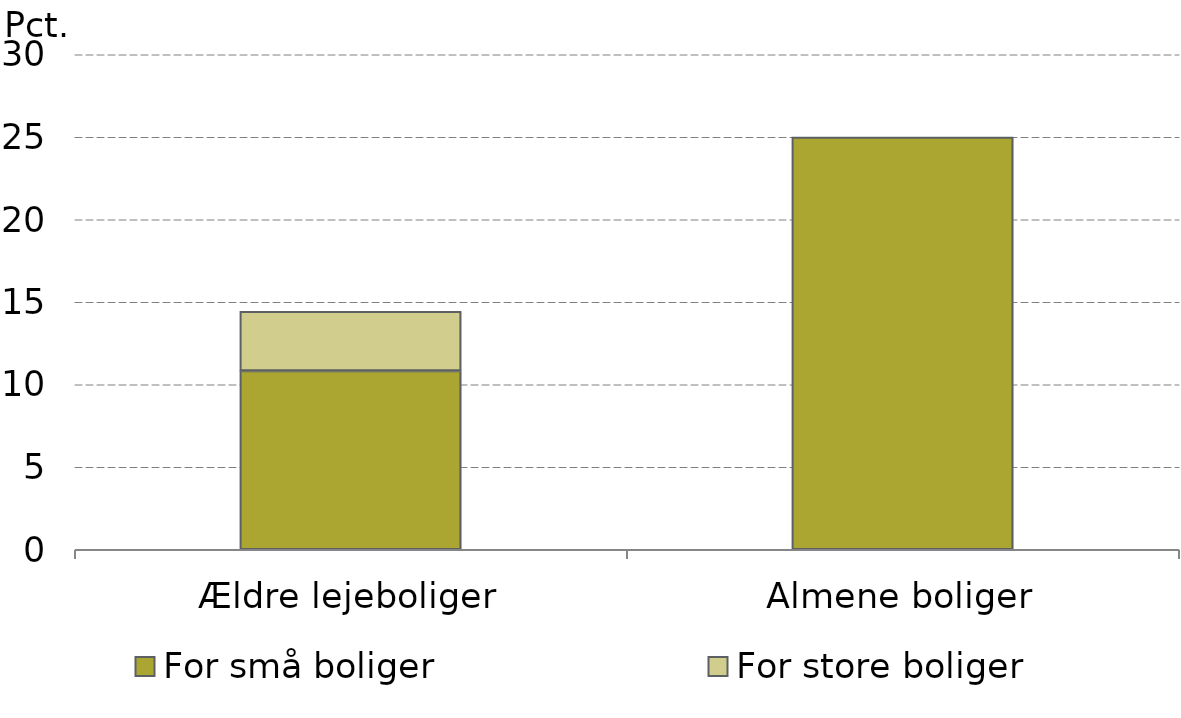
| Category |  For små boliger |  For store boliger |
|---|---|---|
| 0 | 10.826 | 3.596 |
| 1 | 24.98 | 0 |